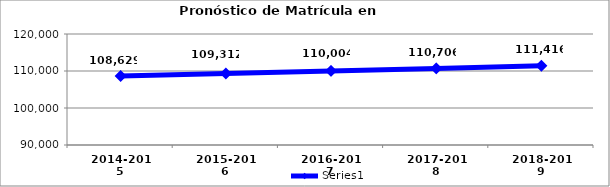
| Category | Series 0 |
|---|---|
| 2014-2015 | 108628.597 |
| 2015-2016 | 109311.985 |
| 2016-2017 | 110004.302 |
| 2017-2018 | 110705.685 |
| 2018-2019 | 111416.277 |